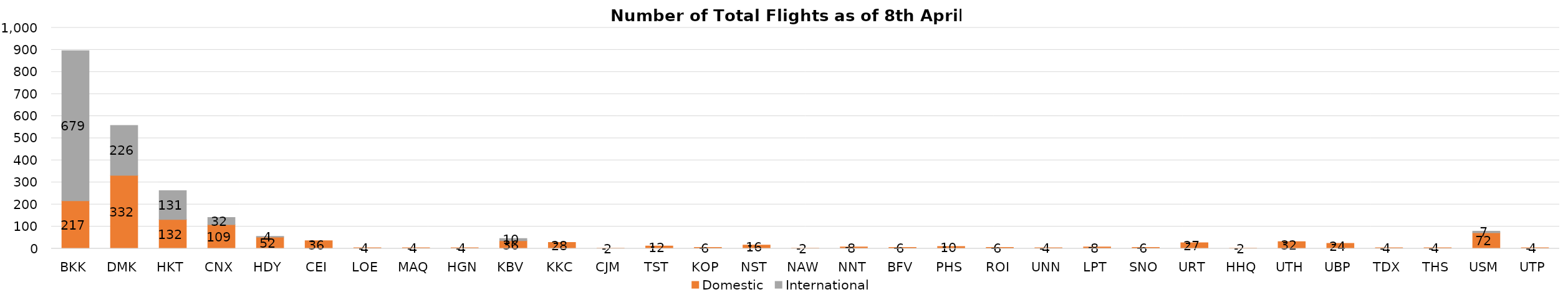
| Category | Domestic | International |
|---|---|---|
| BKK | 217 | 679 |
| DMK | 332 | 226 |
| HKT | 132 | 131 |
| CNX | 109 | 32 |
| HDY | 52 | 4 |
| CEI | 36 | 0 |
| LOE | 4 | 0 |
| MAQ | 4 | 0 |
| HGN | 4 | 0 |
| KBV | 36 | 10 |
| KKC | 28 | 0 |
| CJM | 2 | 0 |
| TST | 12 | 0 |
| KOP | 6 | 0 |
| NST | 16 | 0 |
| NAW | 2 | 0 |
| NNT | 8 | 0 |
| BFV | 6 | 0 |
| PHS | 10 | 0 |
| ROI | 6 | 0 |
| UNN | 4 | 0 |
| LPT | 8 | 0 |
| SNO | 6 | 0 |
| URT | 27 | 0 |
| HHQ | 2 | 0 |
| UTH | 32 | 0 |
| UBP | 24 | 0 |
| TDX | 4 | 0 |
| THS | 4 | 0 |
| USM | 72 | 7 |
| UTP | 4 | 0 |